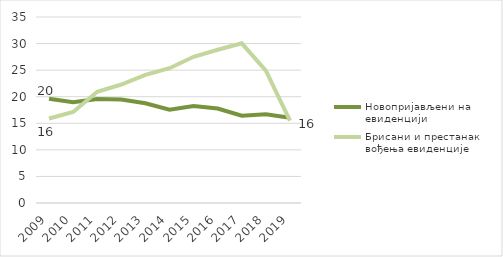
| Category | Новопријављени на евиденцији | Брисани и престанак вођења евиденције |
|---|---|---|
| 2009.0 | 19.636 | 15.891 |
| 2010.0 | 18.953 | 17.135 |
| 2011.0 | 19.552 | 20.94 |
| 2012.0 | 19.49 | 22.291 |
| 2013.0 | 18.755 | 24.097 |
| 2014.0 | 17.538 | 25.36 |
| 2015.0 | 18.251 | 27.516 |
| 2016.0 | 17.78 | 28.832 |
| 2017.0 | 16.411 | 30.047 |
| 2018.0 | 16.682 | 24.89 |
| 2019.0 | 16.045 | 15.506 |